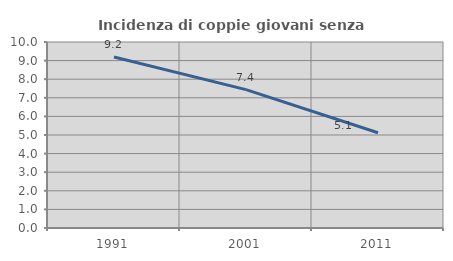
| Category | Incidenza di coppie giovani senza figli |
|---|---|
| 1991.0 | 9.193 |
| 2001.0 | 7.442 |
| 2011.0 | 5.121 |